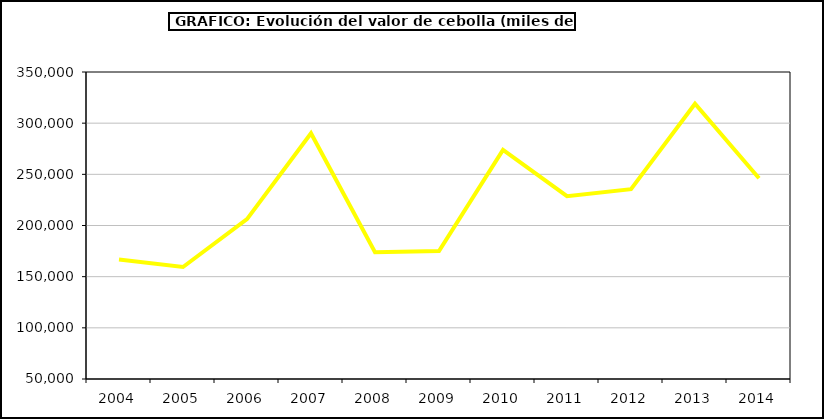
| Category | Valor |
|---|---|
| 2004.0 | 166726.648 |
| 2005.0 | 159459.084 |
| 2006.0 | 206165.812 |
| 2007.0 | 290141.25 |
| 2008.0 | 173831.053 |
| 2009.0 | 175000.918 |
| 2010.0 | 273851.462 |
| 2011.0 | 228687.172 |
| 2012.0 | 235464.837 |
| 2013.0 | 318927.963 |
| 2014.0 | 246223.118 |